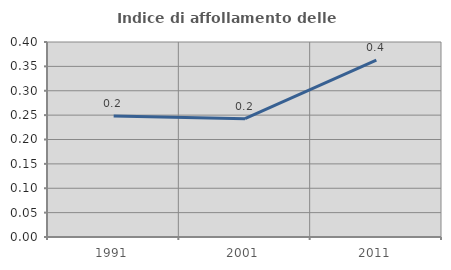
| Category | Indice di affollamento delle abitazioni  |
|---|---|
| 1991.0 | 0.248 |
| 2001.0 | 0.243 |
| 2011.0 | 0.363 |